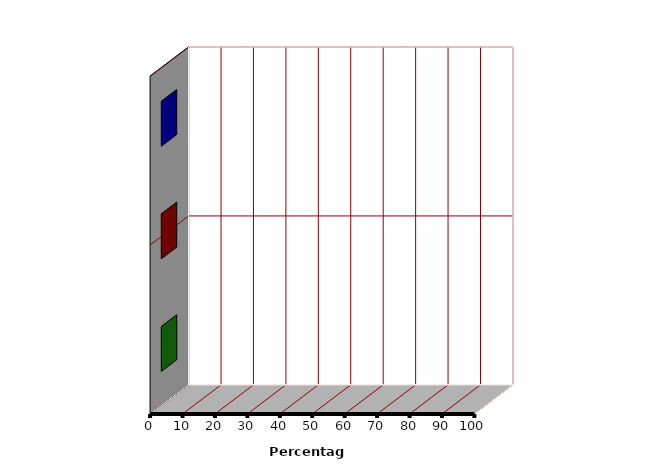
| Category | Series 1 |
|---|---|
| 0 | 0 |
| 1 | 0 |
| 2 | 0 |